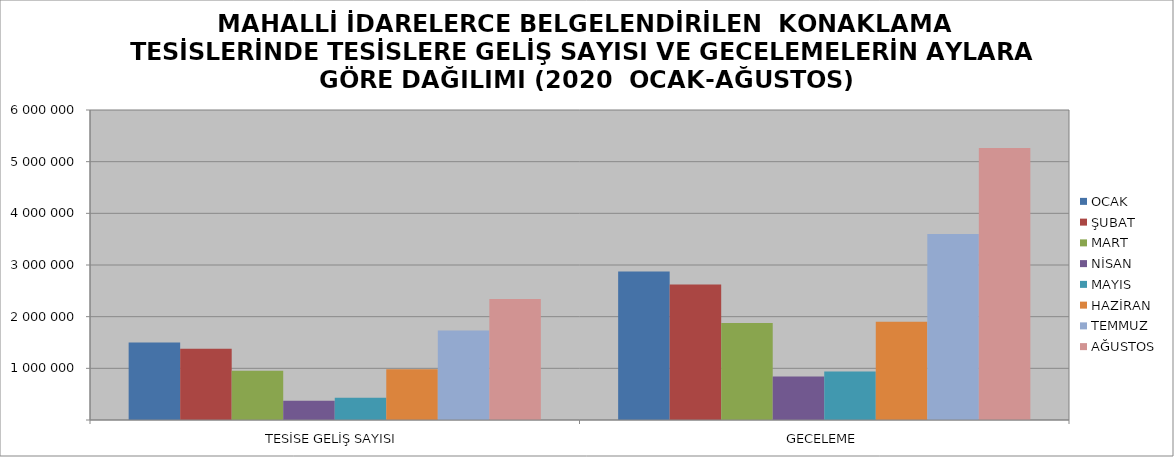
| Category | OCAK | ŞUBAT | MART | NİSAN | MAYIS | HAZİRAN | TEMMUZ | AĞUSTOS |
|---|---|---|---|---|---|---|---|---|
| TESİSE GELİŞ SAYISI | 1497815 | 1380765 | 955554 | 372466 | 430328 | 981538 | 1730606 | 2342031 |
| GECELEME | 2872303 | 2621819 | 1878971 | 839735 | 939652 | 1902057 | 3601580 | 5263679 |